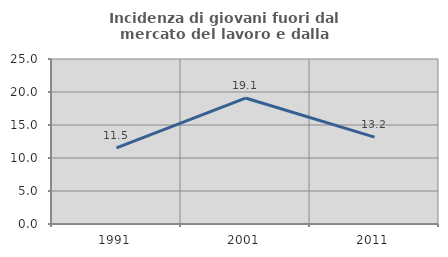
| Category | Incidenza di giovani fuori dal mercato del lavoro e dalla formazione  |
|---|---|
| 1991.0 | 11.541 |
| 2001.0 | 19.084 |
| 2011.0 | 13.154 |